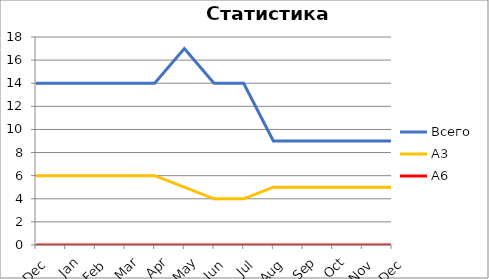
| Category | Всего | А3 | A6 |
|---|---|---|---|
| 0 | 14 | 6 | 0 |
| 1 | 14 | 6 | 0 |
| 2 | 14 | 6 | 0 |
| 3 | 14 | 6 | 0 |
| 4 | 14 | 6 | 0 |
| 5 | 17 | 5 | 0 |
| 6 | 14 | 4 | 0 |
| 7 | 14 | 4 | 0 |
| 8 | 9 | 5 | 0 |
| 9 | 9 | 5 | 0 |
| 10 | 9 | 5 | 0 |
| 11 | 9 | 5 | 0 |
| 12 | 9 | 5 | 0 |